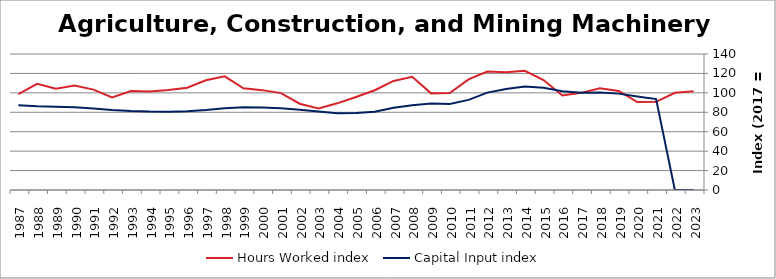
| Category | Hours Worked index | Capital Input index |
|---|---|---|
| 2023.0 | 101.619 | 0 |
| 2022.0 | 100.13 | 0 |
| 2021.0 | 90.715 | 93.651 |
| 2020.0 | 90.502 | 96.222 |
| 2019.0 | 101.967 | 99.209 |
| 2018.0 | 104.729 | 100.257 |
| 2017.0 | 100 | 100 |
| 2016.0 | 97.228 | 101.749 |
| 2015.0 | 113.179 | 105.172 |
| 2014.0 | 122.714 | 106.593 |
| 2013.0 | 121.193 | 104.038 |
| 2012.0 | 122.014 | 100.252 |
| 2011.0 | 113.884 | 92.799 |
| 2010.0 | 99.767 | 88.439 |
| 2009.0 | 99.472 | 89.118 |
| 2008.0 | 116.522 | 87.247 |
| 2007.0 | 112.296 | 84.575 |
| 2006.0 | 102.664 | 80.553 |
| 2005.0 | 95.769 | 79.319 |
| 2004.0 | 89.222 | 78.96 |
| 2003.0 | 83.828 | 80.79 |
| 2002.0 | 88.795 | 82.606 |
| 2001.0 | 99.718 | 84.262 |
| 2000.0 | 102.801 | 84.98 |
| 1999.0 | 104.697 | 85.075 |
| 1998.0 | 117.006 | 84.259 |
| 1997.0 | 113.009 | 82.313 |
| 1996.0 | 105.234 | 80.958 |
| 1995.0 | 102.974 | 80.632 |
| 1994.0 | 101.388 | 80.722 |
| 1993.0 | 101.846 | 81.264 |
| 1992.0 | 95.173 | 82.235 |
| 1991.0 | 103.321 | 83.826 |
| 1990.0 | 107.504 | 85.109 |
| 1989.0 | 104.282 | 85.731 |
| 1988.0 | 109.301 | 86.225 |
| 1987.0 | 98.715 | 87.28 |